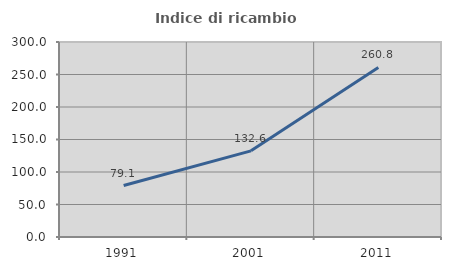
| Category | Indice di ricambio occupazionale  |
|---|---|
| 1991.0 | 79.137 |
| 2001.0 | 132.558 |
| 2011.0 | 260.774 |